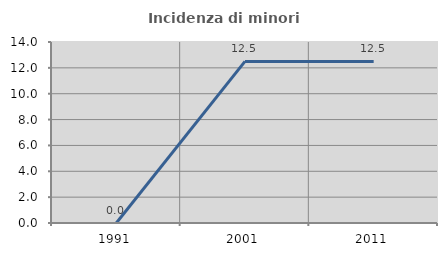
| Category | Incidenza di minori stranieri |
|---|---|
| 1991.0 | 0 |
| 2001.0 | 12.5 |
| 2011.0 | 12.5 |